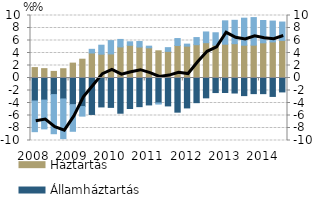
| Category | Háztartás | Államháztartás | Vállalat |
|---|---|---|---|
| 2008.0 | 1.667 | -3.681 | -4.907 |
| 2008.0 | 1.498 | -3.534 | -4.607 |
| 2008.0 | 1.055 | -2.654 | -6.261 |
| 2008.0 | 1.484 | -3.352 | -6.348 |
| 2009.0 | 2.381 | -4.26 | -4.266 |
| 2009.0 | 3.007 | -4.572 | -1.528 |
| 2009.0 | 3.999 | -5.832 | 0.59 |
| 2009.0 | 3.816 | -4.628 | 1.431 |
| 2010.0 | 3.85 | -4.7 | 2.132 |
| 2010.0 | 4.974 | -5.635 | 1.197 |
| 2010.0 | 5.235 | -4.88 | 0.559 |
| 2010.0 | 4.955 | -4.585 | 0.88 |
| 2011.0 | 4.831 | -4.31 | 0.264 |
| 2011.0 | 4.352 | -3.993 | -0.179 |
| 2011.0 | 4.262 | -4.467 | 0.594 |
| 2011.0 | 5.204 | -5.465 | 1.108 |
| 2012.0 | 5.099 | -4.788 | 0.323 |
| 2012.0 | 5.33 | -3.947 | 1.14 |
| 2012.0 | 5.65 | -3.176 | 1.716 |
| 2012.0 | 5.256 | -2.33 | 1.981 |
| 2013.0 | 5.41 | -2.321 | 3.736 |
| 2013.0 | 5.489 | -2.402 | 3.74 |
| 2013.0 | 5.252 | -2.818 | 4.321 |
| 2013.0 | 5.257 | -2.499 | 4.408 |
| 2014.0 | 5.631 | -2.504 | 3.564 |
| 2014.0 | 5.769 | -2.948 | 3.34 |
| 2014.0 | 6.015 | -2.227 | 2.939 |